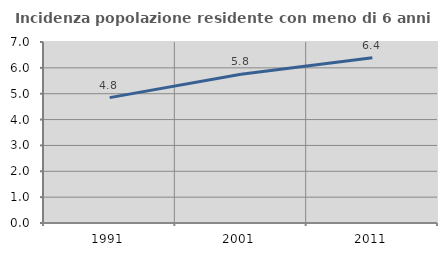
| Category | Incidenza popolazione residente con meno di 6 anni |
|---|---|
| 1991.0 | 4.848 |
| 2001.0 | 5.751 |
| 2011.0 | 6.389 |